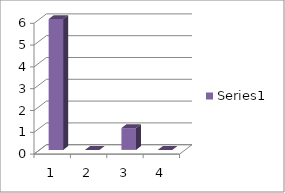
| Category | Series 0 |
|---|---|
| 0 | 6 |
| 1 | 0 |
| 2 | 1 |
| 3 | 0 |